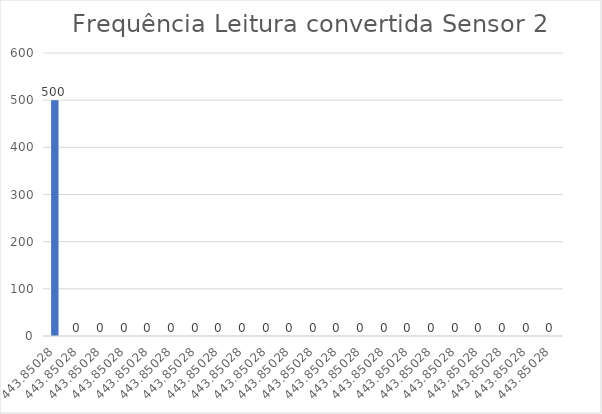
| Category | Series 0 |
|---|---|
| 443.85028 | 500 |
| 443.85028 | 0 |
| 443.85028 | 0 |
| 443.85028 | 0 |
| 443.85028 | 0 |
| 443.85028 | 0 |
| 443.85028 | 0 |
| 443.85028 | 0 |
| 443.85028 | 0 |
| 443.85028 | 0 |
| 443.85028 | 0 |
| 443.85028 | 0 |
| 443.85028 | 0 |
| 443.85028 | 0 |
| 443.85028 | 0 |
| 443.85028 | 0 |
| 443.85028 | 0 |
| 443.85028 | 0 |
| 443.85028 | 0 |
| 443.85028 | 0 |
| 443.85028 | 0 |
| 443.85028 | 0 |